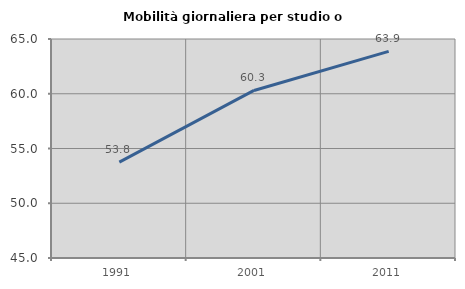
| Category | Mobilità giornaliera per studio o lavoro |
|---|---|
| 1991.0 | 53.762 |
| 2001.0 | 60.303 |
| 2011.0 | 63.87 |